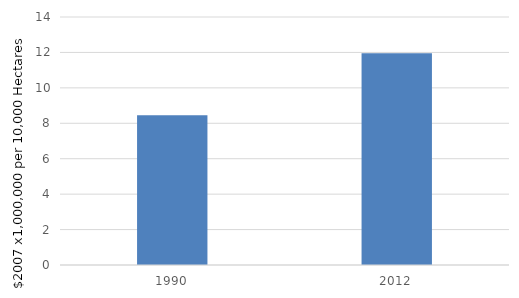
| Category | Crop and animal production |
|---|---|
| 1990.0 | 8.46 |
| 2012.0 | 11.954 |